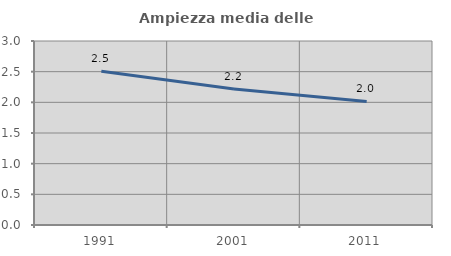
| Category | Ampiezza media delle famiglie |
|---|---|
| 1991.0 | 2.507 |
| 2001.0 | 2.219 |
| 2011.0 | 2.014 |